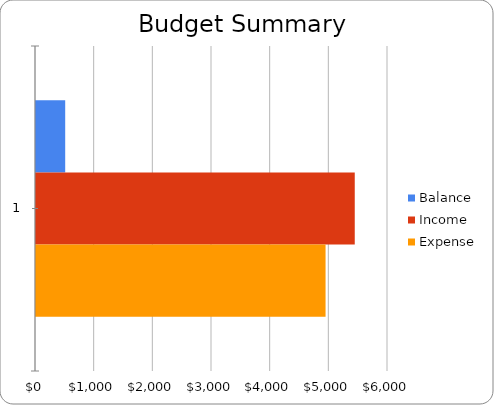
| Category | Balance | Income | Expense |
|---|---|---|---|
| 0 | 497.667 | 5433.333 | 4935.667 |